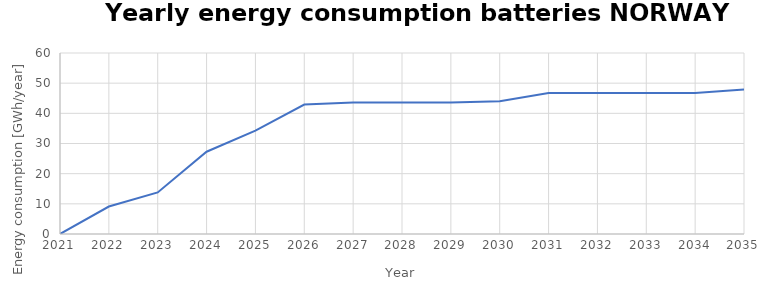
| Category | Total Battery |
|---|---|
| 2021.0 | 0 |
| 2022.0 | 9.114 |
| 2023.0 | 13.784 |
| 2024.0 | 27.279 |
| 2025.0 | 34.281 |
| 2026.0 | 42.924 |
| 2027.0 | 43.555 |
| 2028.0 | 43.555 |
| 2029.0 | 43.555 |
| 2030.0 | 43.971 |
| 2031.0 | 46.719 |
| 2032.0 | 46.719 |
| 2033.0 | 46.719 |
| 2034.0 | 46.719 |
| 2035.0 | 47.911 |